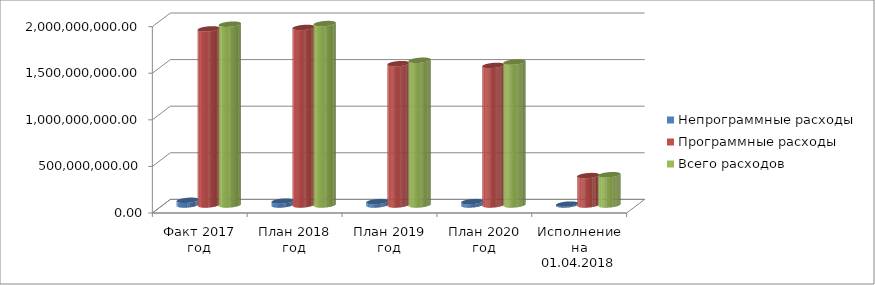
| Category | Непрограммные расходы | Программные расходы | Всего расходов |
|---|---|---|---|
| Факт 2017 год | 50452774.48 | 1889860103.04 | 1940312877.52 |
| План 2018 год | 41498100 | 1905543810 | 1947041910 |
| План 2019 год | 36494820 | 1516957990 | 1553452810 |
| План 2020 год | 36515620 | 1497604780 | 1534120400 |
| Исполнение на 01.04.2018 года | 9599558.3 | 315563575.66 | 325163133.96 |